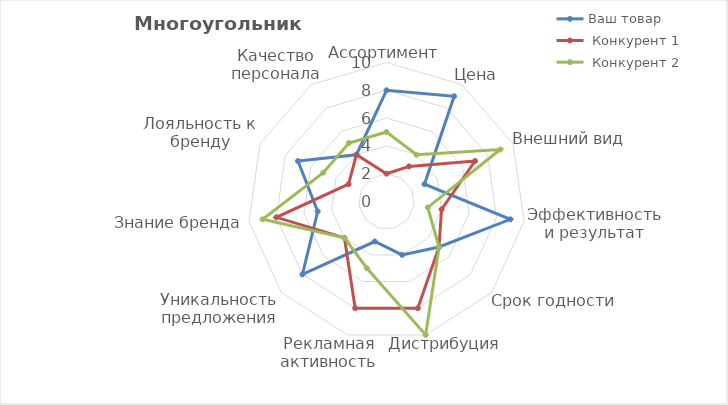
| Category | Ваш товар |  Конкурент 1 |  Конкурент 2 |
|---|---|---|---|
| Ассортимент | 8 | 2 | 5 |
| Цена | 9 | 3 | 4 |
| Внешний вид | 3 | 7 | 9 |
| Эффективность и результат | 9 | 4 | 3 |
| Срок годности | 5 | 5 | 5 |
| Дистрибуция | 4 | 8 | 10 |
| Рекламная активность | 3 | 8 | 5 |
| Уникальность предложения | 8 | 4 | 4 |
| Знание бренда | 5 | 8 | 9 |
| Лояльность к бренду | 7 | 3 | 5 |
| Качество персонала | 4 | 4 | 5 |